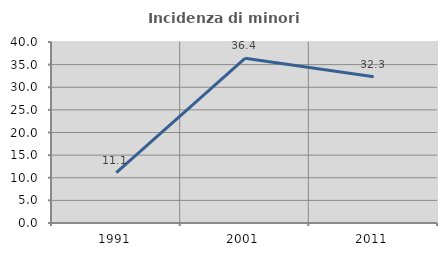
| Category | Incidenza di minori stranieri |
|---|---|
| 1991.0 | 11.111 |
| 2001.0 | 36.393 |
| 2011.0 | 32.319 |